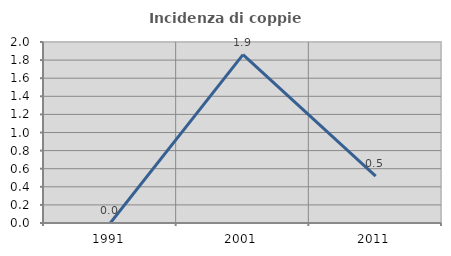
| Category | Incidenza di coppie miste |
|---|---|
| 1991.0 | 0 |
| 2001.0 | 1.86 |
| 2011.0 | 0.518 |